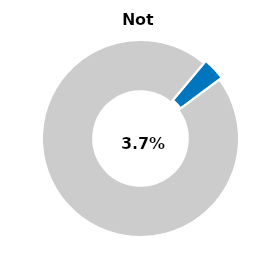
| Category | Series 0 |
|---|---|
| Not passed | 0.037 |
| Other | 0.963 |